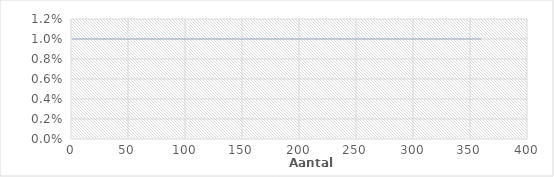
| Category | Interest Rate History |
|---|---|
| 1.0 | 0.01 |
| 2.0 | 0.01 |
| 3.0 | 0.01 |
| 4.0 | 0.01 |
| 5.0 | 0.01 |
| 6.0 | 0.01 |
| 7.0 | 0.01 |
| 8.0 | 0.01 |
| 9.0 | 0.01 |
| 10.0 | 0.01 |
| 11.0 | 0.01 |
| 12.0 | 0.01 |
| 13.0 | 0.01 |
| 14.0 | 0.01 |
| 15.0 | 0.01 |
| 16.0 | 0.01 |
| 17.0 | 0.01 |
| 18.0 | 0.01 |
| 19.0 | 0.01 |
| 20.0 | 0.01 |
| 21.0 | 0.01 |
| 22.0 | 0.01 |
| 23.0 | 0.01 |
| 24.0 | 0.01 |
| 25.0 | 0.01 |
| 26.0 | 0.01 |
| 27.0 | 0.01 |
| 28.0 | 0.01 |
| 29.0 | 0.01 |
| 30.0 | 0.01 |
| 31.0 | 0.01 |
| 32.0 | 0.01 |
| 33.0 | 0.01 |
| 34.0 | 0.01 |
| 35.0 | 0.01 |
| 36.0 | 0.01 |
| 37.0 | 0.01 |
| 38.0 | 0.01 |
| 39.0 | 0.01 |
| 40.0 | 0.01 |
| 41.0 | 0.01 |
| 42.0 | 0.01 |
| 43.0 | 0.01 |
| 44.0 | 0.01 |
| 45.0 | 0.01 |
| 46.0 | 0.01 |
| 47.0 | 0.01 |
| 48.0 | 0.01 |
| 49.0 | 0.01 |
| 50.0 | 0.01 |
| 51.0 | 0.01 |
| 52.0 | 0.01 |
| 53.0 | 0.01 |
| 54.0 | 0.01 |
| 55.0 | 0.01 |
| 56.0 | 0.01 |
| 57.0 | 0.01 |
| 58.0 | 0.01 |
| 59.0 | 0.01 |
| 60.0 | 0.01 |
| 61.0 | 0.01 |
| 62.0 | 0.01 |
| 63.0 | 0.01 |
| 64.0 | 0.01 |
| 65.0 | 0.01 |
| 66.0 | 0.01 |
| 67.0 | 0.01 |
| 68.0 | 0.01 |
| 69.0 | 0.01 |
| 70.0 | 0.01 |
| 71.0 | 0.01 |
| 72.0 | 0.01 |
| 73.0 | 0.01 |
| 74.0 | 0.01 |
| 75.0 | 0.01 |
| 76.0 | 0.01 |
| 77.0 | 0.01 |
| 78.0 | 0.01 |
| 79.0 | 0.01 |
| 80.0 | 0.01 |
| 81.0 | 0.01 |
| 82.0 | 0.01 |
| 83.0 | 0.01 |
| 84.0 | 0.01 |
| 85.0 | 0.01 |
| 86.0 | 0.01 |
| 87.0 | 0.01 |
| 88.0 | 0.01 |
| 89.0 | 0.01 |
| 90.0 | 0.01 |
| 91.0 | 0.01 |
| 92.0 | 0.01 |
| 93.0 | 0.01 |
| 94.0 | 0.01 |
| 95.0 | 0.01 |
| 96.0 | 0.01 |
| 97.0 | 0.01 |
| 98.0 | 0.01 |
| 99.0 | 0.01 |
| 100.0 | 0.01 |
| 101.0 | 0.01 |
| 102.0 | 0.01 |
| 103.0 | 0.01 |
| 104.0 | 0.01 |
| 105.0 | 0.01 |
| 106.0 | 0.01 |
| 107.0 | 0.01 |
| 108.0 | 0.01 |
| 109.0 | 0.01 |
| 110.0 | 0.01 |
| 111.0 | 0.01 |
| 112.0 | 0.01 |
| 113.0 | 0.01 |
| 114.0 | 0.01 |
| 115.0 | 0.01 |
| 116.0 | 0.01 |
| 117.0 | 0.01 |
| 118.0 | 0.01 |
| 119.0 | 0.01 |
| 120.0 | 0.01 |
| 121.0 | 0.01 |
| 122.0 | 0.01 |
| 123.0 | 0.01 |
| 124.0 | 0.01 |
| 125.0 | 0.01 |
| 126.0 | 0.01 |
| 127.0 | 0.01 |
| 128.0 | 0.01 |
| 129.0 | 0.01 |
| 130.0 | 0.01 |
| 131.0 | 0.01 |
| 132.0 | 0.01 |
| 133.0 | 0.01 |
| 134.0 | 0.01 |
| 135.0 | 0.01 |
| 136.0 | 0.01 |
| 137.0 | 0.01 |
| 138.0 | 0.01 |
| 139.0 | 0.01 |
| 140.0 | 0.01 |
| 141.0 | 0.01 |
| 142.0 | 0.01 |
| 143.0 | 0.01 |
| 144.0 | 0.01 |
| 145.0 | 0.01 |
| 146.0 | 0.01 |
| 147.0 | 0.01 |
| 148.0 | 0.01 |
| 149.0 | 0.01 |
| 150.0 | 0.01 |
| 151.0 | 0.01 |
| 152.0 | 0.01 |
| 153.0 | 0.01 |
| 154.0 | 0.01 |
| 155.0 | 0.01 |
| 156.0 | 0.01 |
| 157.0 | 0.01 |
| 158.0 | 0.01 |
| 159.0 | 0.01 |
| 160.0 | 0.01 |
| 161.0 | 0.01 |
| 162.0 | 0.01 |
| 163.0 | 0.01 |
| 164.0 | 0.01 |
| 165.0 | 0.01 |
| 166.0 | 0.01 |
| 167.0 | 0.01 |
| 168.0 | 0.01 |
| 169.0 | 0.01 |
| 170.0 | 0.01 |
| 171.0 | 0.01 |
| 172.0 | 0.01 |
| 173.0 | 0.01 |
| 174.0 | 0.01 |
| 175.0 | 0.01 |
| 176.0 | 0.01 |
| 177.0 | 0.01 |
| 178.0 | 0.01 |
| 179.0 | 0.01 |
| 180.0 | 0.01 |
| 181.0 | 0.01 |
| 182.0 | 0.01 |
| 183.0 | 0.01 |
| 184.0 | 0.01 |
| 185.0 | 0.01 |
| 186.0 | 0.01 |
| 187.0 | 0.01 |
| 188.0 | 0.01 |
| 189.0 | 0.01 |
| 190.0 | 0.01 |
| 191.0 | 0.01 |
| 192.0 | 0.01 |
| 193.0 | 0.01 |
| 194.0 | 0.01 |
| 195.0 | 0.01 |
| 196.0 | 0.01 |
| 197.0 | 0.01 |
| 198.0 | 0.01 |
| 199.0 | 0.01 |
| 200.0 | 0.01 |
| 201.0 | 0.01 |
| 202.0 | 0.01 |
| 203.0 | 0.01 |
| 204.0 | 0.01 |
| 205.0 | 0.01 |
| 206.0 | 0.01 |
| 207.0 | 0.01 |
| 208.0 | 0.01 |
| 209.0 | 0.01 |
| 210.0 | 0.01 |
| 211.0 | 0.01 |
| 212.0 | 0.01 |
| 213.0 | 0.01 |
| 214.0 | 0.01 |
| 215.0 | 0.01 |
| 216.0 | 0.01 |
| 217.0 | 0.01 |
| 218.0 | 0.01 |
| 219.0 | 0.01 |
| 220.0 | 0.01 |
| 221.0 | 0.01 |
| 222.0 | 0.01 |
| 223.0 | 0.01 |
| 224.0 | 0.01 |
| 225.0 | 0.01 |
| 226.0 | 0.01 |
| 227.0 | 0.01 |
| 228.0 | 0.01 |
| 229.0 | 0.01 |
| 230.0 | 0.01 |
| 231.0 | 0.01 |
| 232.0 | 0.01 |
| 233.0 | 0.01 |
| 234.0 | 0.01 |
| 235.0 | 0.01 |
| 236.0 | 0.01 |
| 237.0 | 0.01 |
| 238.0 | 0.01 |
| 239.0 | 0.01 |
| 240.0 | 0.01 |
| 241.0 | 0.01 |
| 242.0 | 0.01 |
| 243.0 | 0.01 |
| 244.0 | 0.01 |
| 245.0 | 0.01 |
| 246.0 | 0.01 |
| 247.0 | 0.01 |
| 248.0 | 0.01 |
| 249.0 | 0.01 |
| 250.0 | 0.01 |
| 251.0 | 0.01 |
| 252.0 | 0.01 |
| 253.0 | 0.01 |
| 254.0 | 0.01 |
| 255.0 | 0.01 |
| 256.0 | 0.01 |
| 257.0 | 0.01 |
| 258.0 | 0.01 |
| 259.0 | 0.01 |
| 260.0 | 0.01 |
| 261.0 | 0.01 |
| 262.0 | 0.01 |
| 263.0 | 0.01 |
| 264.0 | 0.01 |
| 265.0 | 0.01 |
| 266.0 | 0.01 |
| 267.0 | 0.01 |
| 268.0 | 0.01 |
| 269.0 | 0.01 |
| 270.0 | 0.01 |
| 271.0 | 0.01 |
| 272.0 | 0.01 |
| 273.0 | 0.01 |
| 274.0 | 0.01 |
| 275.0 | 0.01 |
| 276.0 | 0.01 |
| 277.0 | 0.01 |
| 278.0 | 0.01 |
| 279.0 | 0.01 |
| 280.0 | 0.01 |
| 281.0 | 0.01 |
| 282.0 | 0.01 |
| 283.0 | 0.01 |
| 284.0 | 0.01 |
| 285.0 | 0.01 |
| 286.0 | 0.01 |
| 287.0 | 0.01 |
| 288.0 | 0.01 |
| 289.0 | 0.01 |
| 290.0 | 0.01 |
| 291.0 | 0.01 |
| 292.0 | 0.01 |
| 293.0 | 0.01 |
| 294.0 | 0.01 |
| 295.0 | 0.01 |
| 296.0 | 0.01 |
| 297.0 | 0.01 |
| 298.0 | 0.01 |
| 299.0 | 0.01 |
| 300.0 | 0.01 |
| 301.0 | 0.01 |
| 302.0 | 0.01 |
| 303.0 | 0.01 |
| 304.0 | 0.01 |
| 305.0 | 0.01 |
| 306.0 | 0.01 |
| 307.0 | 0.01 |
| 308.0 | 0.01 |
| 309.0 | 0.01 |
| 310.0 | 0.01 |
| 311.0 | 0.01 |
| 312.0 | 0.01 |
| 313.0 | 0.01 |
| 314.0 | 0.01 |
| 315.0 | 0.01 |
| 316.0 | 0.01 |
| 317.0 | 0.01 |
| 318.0 | 0.01 |
| 319.0 | 0.01 |
| 320.0 | 0.01 |
| 321.0 | 0.01 |
| 322.0 | 0.01 |
| 323.0 | 0.01 |
| 324.0 | 0.01 |
| 325.0 | 0.01 |
| 326.0 | 0.01 |
| 327.0 | 0.01 |
| 328.0 | 0.01 |
| 329.0 | 0.01 |
| 330.0 | 0.01 |
| 331.0 | 0.01 |
| 332.0 | 0.01 |
| 333.0 | 0.01 |
| 334.0 | 0.01 |
| 335.0 | 0.01 |
| 336.0 | 0.01 |
| 337.0 | 0.01 |
| 338.0 | 0.01 |
| 339.0 | 0.01 |
| 340.0 | 0.01 |
| 341.0 | 0.01 |
| 342.0 | 0.01 |
| 343.0 | 0.01 |
| 344.0 | 0.01 |
| 345.0 | 0.01 |
| 346.0 | 0.01 |
| 347.0 | 0.01 |
| 348.0 | 0.01 |
| 349.0 | 0.01 |
| 350.0 | 0.01 |
| 351.0 | 0.01 |
| 352.0 | 0.01 |
| 353.0 | 0.01 |
| 354.0 | 0.01 |
| 355.0 | 0.01 |
| 356.0 | 0.01 |
| 357.0 | 0.01 |
| 358.0 | 0.01 |
| 359.0 | 0.01 |
| 360.0 | 0.01 |